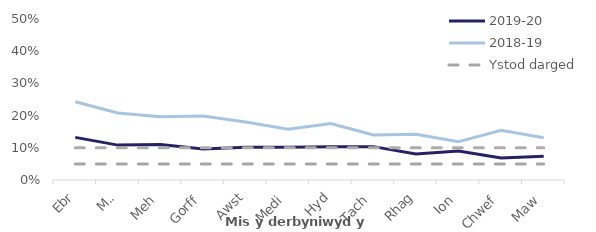
| Category | 2019-20 |
|---|---|
| Ebr | 0.132 |
| Mai | 0.108 |
| Meh | 0.111 |
| Gorff | 0.097 |
| Awst | 0.102 |
| Medi | 0.102 |
| Hyd | 0.103 |
| Tach | 0.104 |
| Rhag | 0.081 |
| Ion | 0.09 |
| Chwef | 0.068 |
| Maw | 0.073 |